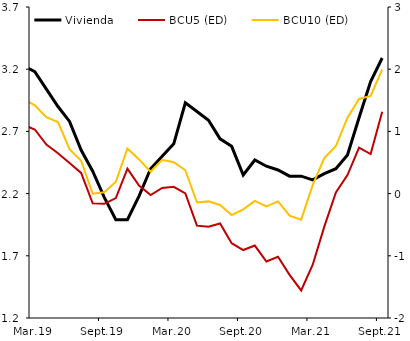
| Category | Vivienda |
|---|---|
| 2013-01-01 | 4.43 |
| 2013-02-01 | 4.52 |
| 2013-03-01 | 4.53 |
| 2013-04-01 | 4.53 |
| 2013-05-01 | 4.51 |
| 2013-06-01 | 4.45 |
| 2013-07-01 | 4.46 |
| 2013-08-01 | 4.49 |
| 2013-09-01 | 4.37 |
| 2013-10-01 | 4.39 |
| 2013-11-01 | 4.36 |
| 2013-12-01 | 4.36 |
| 2014-01-01 | 4.32 |
| 2014-02-01 | 4.3 |
| 2014-03-01 | 4.3 |
| 2014-04-01 | 4.25 |
| 2014-05-01 | 4.14 |
| 2014-06-01 | 3.94 |
| 2014-07-01 | 3.86 |
| 2014-08-01 | 3.67 |
| 2014-09-01 | 3.58 |
| 2014-10-01 | 3.57 |
| 2014-11-01 | 3.65 |
| 2014-12-01 | 3.73 |
| 2015-01-01 | 3.75 |
| 2015-02-01 | 3.73 |
| 2015-03-01 | 3.67 |
| 2015-04-01 | 3.6 |
| 2015-05-01 | 3.61 |
| 2015-06-01 | 3.66 |
| 2015-07-01 | 3.67 |
| 2015-08-01 | 3.63 |
| 2015-09-01 | 3.65 |
| 2015-10-01 | 3.64 |
| 2015-11-01 | 3.72 |
| 2015-12-01 | 3.77 |
| 2016-01-01 | 3.832 |
| 2016-02-01 | 3.829 |
| 2016-03-01 | 3.806 |
| 2016-04-01 | 3.785 |
| 2016-05-01 | 3.788 |
| 2016-06-01 | 3.757 |
| 2016-07-01 | 3.726 |
| 2016-08-01 | 3.721 |
| 2016-09-01 | 3.664 |
| 2016-10-01 | 3.558 |
| 2016-11-01 | 3.51 |
| 2016-12-01 | 3.589 |
| 2017-01-01 | 3.616 |
| 2017-02-01 | 3.55 |
| 2017-03-01 | 3.47 |
| 2017-04-01 | 3.42 |
| 2017-05-01 | 3.36 |
| 2017-06-01 | 3.29 |
| 2017-07-01 | 3.2 |
| 2017-08-01 | 3.19 |
| 2017-09-01 | 3.2 |
| 2017-10-01 | 3.26 |
| 2017-11-01 | 3.35 |
| 2017-12-01 | 3.48 |
| 2018-01-01 | 3.52 |
| 2018-02-01 | 3.54 |
| 2018-03-01 | 3.5 |
| 2018-04-01 | 3.45 |
| 2018-05-01 | 3.41 |
| 2018-06-01 | 3.34 |
| 2018-07-01 | 3.33 |
| 2018-08-01 | 3.23 |
| 2018-09-01 | 3.22 |
| 2018-10-01 | 3.17 |
| 2018-11-01 | 3.23 |
| 2018-12-01 | 3.28 |
| 2019-01-01 | 3.24 |
| 2019-02-01 | 3.23 |
| 2019-03-01 | 3.18 |
| 2019-04-01 | 3.04 |
| 2019-05-01 | 2.9 |
| 2019-06-01 | 2.78 |
| 2019-07-01 | 2.55 |
| 2019-08-01 | 2.38 |
| 2019-09-01 | 2.17 |
| 2019-10-01 | 1.99 |
| 2019-11-01 | 1.99 |
| 2019-12-01 | 2.18 |
| 2020-01-01 | 2.4 |
| 2020-02-01 | 2.5 |
| 2020-03-01 | 2.6 |
| 2020-04-01 | 2.93 |
| 2020-05-01 | 2.86 |
| 2020-06-01 | 2.79 |
| 2020-07-01 | 2.64 |
| 2020-08-01 | 2.58 |
| 2020-09-01 | 2.35 |
| 2020-10-01 | 2.47 |
| 2020-11-01 | 2.42 |
| 2020-12-01 | 2.39 |
| 2021-01-01 | 2.34 |
| 2021-02-01 | 2.34 |
| 2021-03-01 | 2.31 |
| 2021-04-01 | 2.36 |
| 2021-05-01 | 2.4 |
| 2021-06-01 | 2.51 |
| 2021-07-01 | 2.81 |
| 2021-08-01 | 3.1 |
| 2021-09-01 | 3.29 |